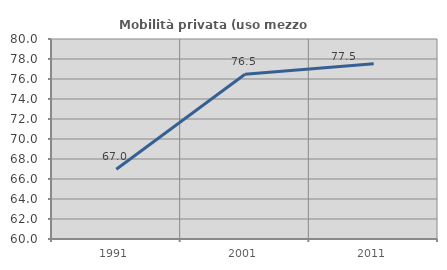
| Category | Mobilità privata (uso mezzo privato) |
|---|---|
| 1991.0 | 66.978 |
| 2001.0 | 76.471 |
| 2011.0 | 77.529 |